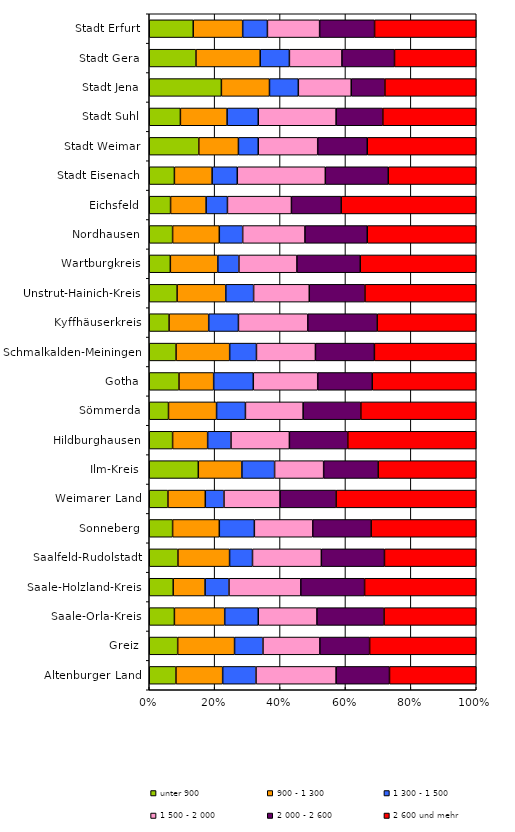
| Category | unter 900  | 900 - 1 300 | 1 300 - 1 500 | 1 500 - 2 000 | 2 000 - 2 600 | 2 600 und mehr |
|---|---|---|---|---|---|---|
| Altenburger Land | 4 | 7 | 5 | 12 | 8 | 13 |
| Greiz | 4 | 8 | 4 | 8 | 7 | 15 |
| Saale-Orla-Kreis | 3 | 6 | 4 | 7 | 8 | 11 |
| Saale-Holzland-Kreis | 3 | 4 | 3 | 9 | 8 | 14 |
| Saalfeld-Rudolstadt | 5 | 9 | 4 | 12 | 11 | 16 |
| Sonneberg | 2 | 4 | 3 | 5 | 5 | 9 |
| Weimarer Land | 2 | 4 | 2 | 6 | 6 | 15 |
| Ilm-Kreis | 9 | 8 | 6 | 9 | 10 | 18 |
| Hildburghausen | 2 | 3 | 2 | 5 | 5 | 11 |
| Sömmerda | 2 | 5 | 3 | 6 | 6 | 12 |
| Gotha | 6 | 7 | 8 | 13 | 11 | 21 |
| Schmalkalden-Meiningen | 5 | 10 | 5 | 11 | 11 | 19 |
| Kyffhäuserkreis | 2 | 4 | 3 | 7 | 7 | 10 |
| Unstrut-Hainich-Kreis | 4 | 7 | 4 | 8 | 8 | 16 |
| Wartburgkreis | 4 | 9 | 4 | 11 | 12 | 22 |
| Nordhausen | 3 | 6 | 3 | 8 | 8 | 14 |
| Eichsfeld | 3 | 5 | 3 | 9 | 7 | 19 |
| Stadt Eisenach | 2 | 3 | 2 | 7 | 5 | 7 |
| Stadt Weimar | 5 | 4 | 2 | 6 | 5 | 11 |
| Stadt Suhl | 2 | 3 | 2 | 5 | 3 | 6 |
| Stadt Jena | 15 | 10 | 6 | 11 | 7 | 19 |
| Stadt Gera | 8 | 11 | 5 | 9 | 9 | 14 |
| Stadt Erfurt | 16 | 18 | 9 | 19 | 20 | 37 |